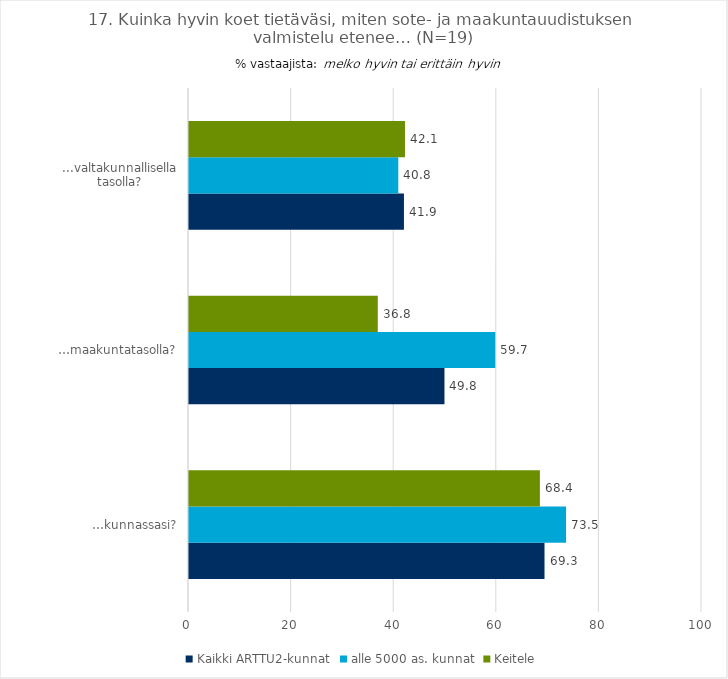
| Category | Kaikki ARTTU2-kunnat | alle 5000 as. kunnat | Keitele |
|---|---|---|---|
| …kunnassasi? | 69.3 | 73.5 | 68.4 |
| …maakuntatasolla? | 49.8 | 59.7 | 36.8 |
| ...valtakunnallisella tasolla? | 41.9 | 40.8 | 42.1 |